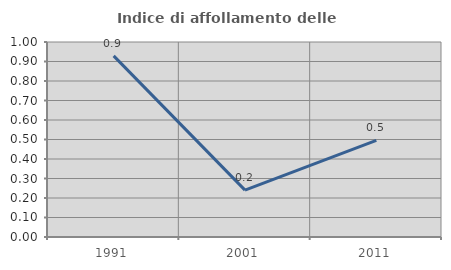
| Category | Indice di affollamento delle abitazioni  |
|---|---|
| 1991.0 | 0.929 |
| 2001.0 | 0.24 |
| 2011.0 | 0.495 |